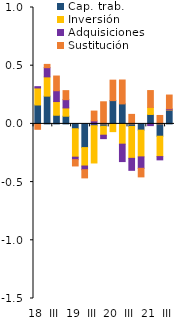
| Category | Cap. trab. | Inversión | Adquisiciones | Sustitución |
|---|---|---|---|---|
| 18 | 0.162 | 0.146 | 0.011 | -0.046 |
| II | 0.239 | 0.165 | 0.079 | 0.028 |
| III | 0.074 | 0.118 | 0.093 | 0.126 |
| IV | 0.066 | 0.071 | 0.071 | 0.077 |
| 19 | -0.042 | -0.244 | -0.021 | -0.054 |
| II | -0.204 | -0.158 | -0.032 | -0.07 |
| III | -0.016 | -0.32 | 0.026 | 0.084 |
| IV | -0.02 | -0.077 | -0.029 | 0.19 |
| 20 | 0.2 | -0.066 | 0 | 0.176 |
| II | 0.172 | -0.174 | -0.15 | 0.205 |
| III | -0.022 | -0.274 | -0.103 | 0.082 |
| IV | -0.054 | -0.23 | -0.098 | -0.074 |
| 21 | 0.081 | 0.06 | -0.015 | 0.145 |
| II | -0.106 | -0.175 | -0.028 | 0.073 |
| III | 0.118 | 0.002 | 0.009 | 0.119 |